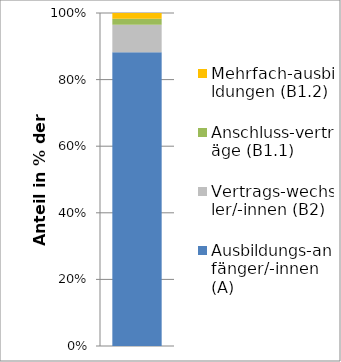
| Category | Ausbildungs-anfänger/-innen (A) | Vertrags-wechsler/-innen (B2) | Anschluss-verträge (B1.1) | Mehrfach-ausbildungen (B1.2) |
|---|---|---|---|---|
| 0 | 0.878 | 0.082 | 0.018 | 0.017 |